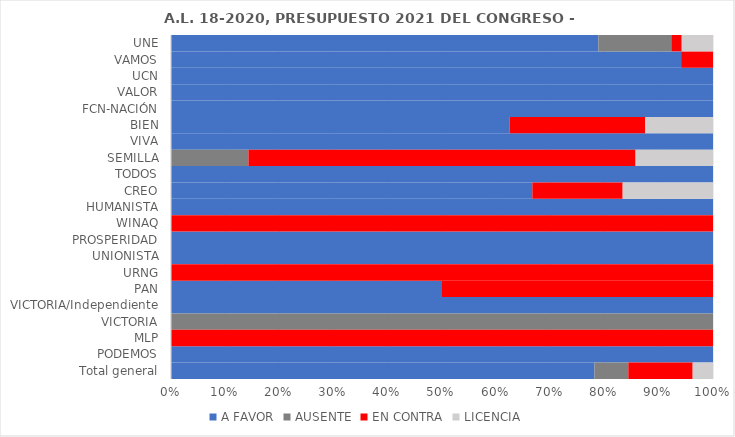
| Category | A FAVOR | AUSENTE | EN CONTRA | LICENCIA |
|---|---|---|---|---|
| UNE | 0.788 | 0.135 | 0.019 | 0.058 |
| VAMOS | 0.941 | 0 | 0.059 | 0 |
| UCN | 1 | 0 | 0 | 0 |
| VALOR | 1 | 0 | 0 | 0 |
| FCN-NACIÓN | 1 | 0 | 0 | 0 |
| BIEN | 0.625 | 0 | 0.25 | 0.125 |
| VIVA | 1 | 0 | 0 | 0 |
| SEMILLA | 0 | 0.143 | 0.714 | 0.143 |
| TODOS | 1 | 0 | 0 | 0 |
| CREO | 0.667 | 0 | 0.167 | 0.167 |
| HUMANISTA | 1 | 0 | 0 | 0 |
| WINAQ | 0 | 0 | 1 | 0 |
| PROSPERIDAD | 1 | 0 | 0 | 0 |
| UNIONISTA | 1 | 0 | 0 | 0 |
| URNG | 0 | 0 | 1 | 0 |
| PAN | 0.5 | 0 | 0.5 | 0 |
| VICTORIA/Independiente | 1 | 0 | 0 | 0 |
| VICTORIA | 0 | 1 | 0 | 0 |
| MLP | 0 | 0 | 1 | 0 |
| PODEMOS | 1 | 0 | 0 | 0 |
| Total general | 0.781 | 0.062 | 0.119 | 0.038 |